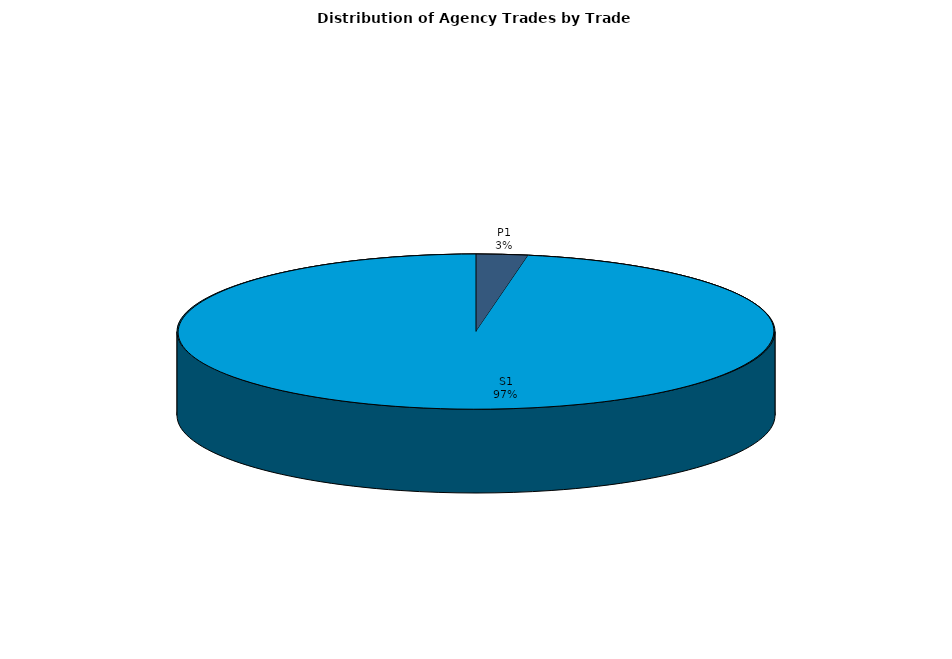
| Category | Series 0 |
|---|---|
| P1 | 70.675 |
| S1 | 2456.933 |